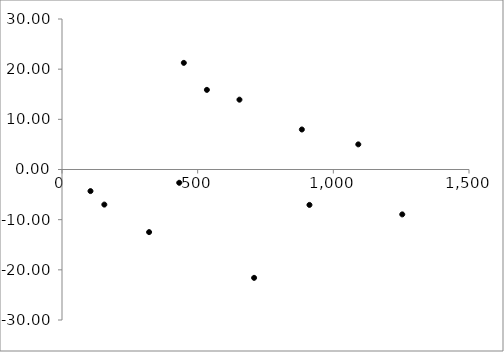
| Category |   |
|---|---|
| 321.0 | -12.48 |
| 1254.0 | -8.947 |
| 105.0 | -4.304 |
| 156.0 | -6.994 |
| 912.0 | -7.06 |
| 708.0 | -21.6 |
| 1092.0 | 5.01 |
| 449.0 | 21.256 |
| 884.0 | 7.975 |
| 654.0 | 13.919 |
| 432.0 | -2.647 |
| 534.0 | 15.873 |